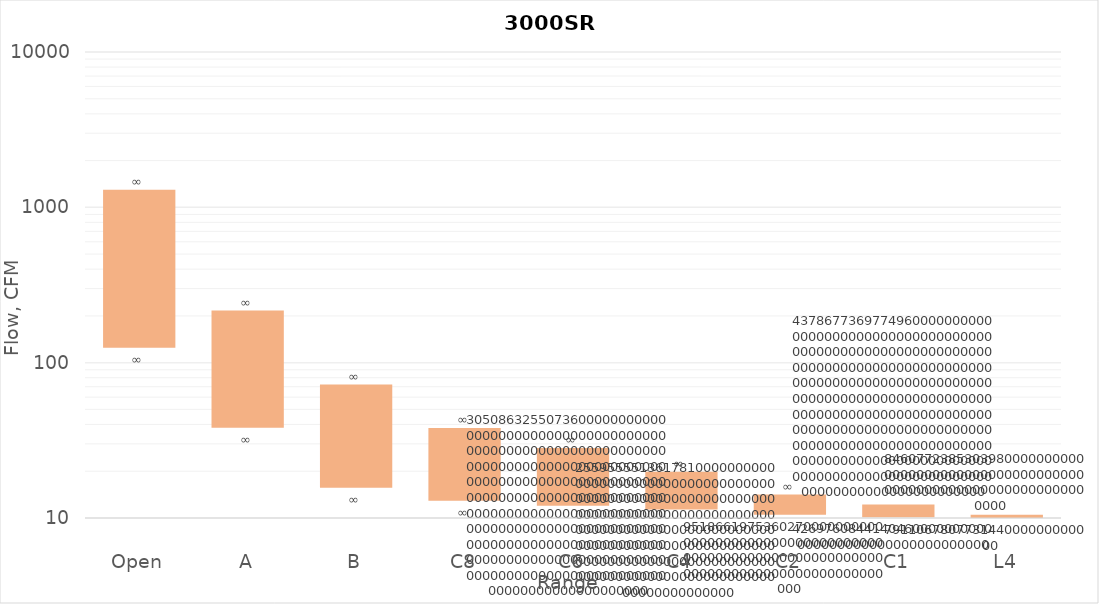
| Category | min Flow, CFM | Series 2 | max Flow, CFM |
|---|---|---|---|
| Open | 3682.4 | 3362.465 | 7044.865 |
| A | 1966.163 | 2489.687 | 4455.85 |
| B | 677.317 | 2194.309 | 2871.626 |
| C8 | 402.313 | 1536.864 | 1939.176 |
| C6 | 294.484 | 1218.729 | 1513.213 |
| C4 | 213.408 | 785.524 | 998.932 |
| C2 | 102.979 | 409.854 | 512.833 |
| C1 | 48.63 | 249.011 | 297.641 |
| L4 | 26.898 | 52.029 | 78.927 |